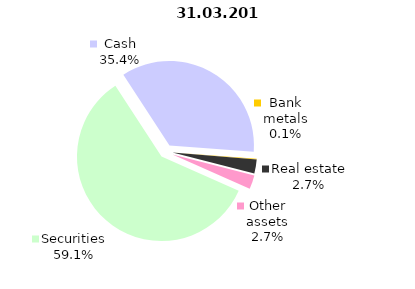
| Category | 31.03.2019 |
|---|---|
| Securities | 1673.5 |
| Cash | 1001.3 |
| Bank metals | 3.7 |
| Real estate | 76.2 |
| Other assets | 75.1 |